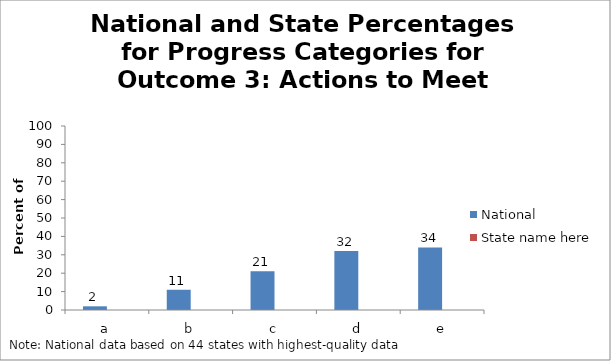
| Category | National | State name here |
|---|---|---|
| a | 2 |  |
| b | 11 |  |
| c | 21 |  |
| d | 32 |  |
| e | 34 |  |